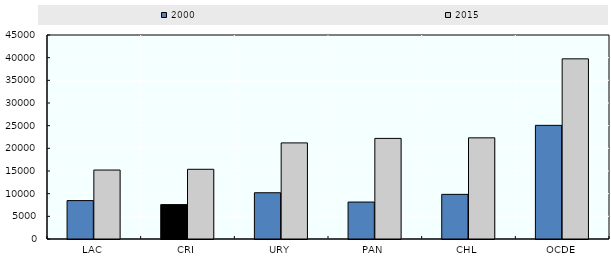
| Category | 2000 | 2015 |
|---|---|---|
| LAC | 8468.979 | 15212.923 |
| CRI | 7588.726 | 15377.23 |
| URY | 10204.914 | 21200.588 |
| PAN | 8150.858 | 22192.054 |
| CHL | 9848.898 | 22316.208 |
| OCDE | 25069.923 | 39741.143 |